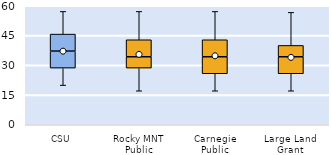
| Category | 25th | 50th | 75th |
|---|---|---|---|
| CSU | 28.571 | 8.571 | 8.571 |
| Rocky MNT Public | 28.571 | 5.714 | 8.571 |
| Carnegie Public | 25.714 | 8.571 | 8.571 |
| Large Land Grant | 25.714 | 8.571 | 5.714 |